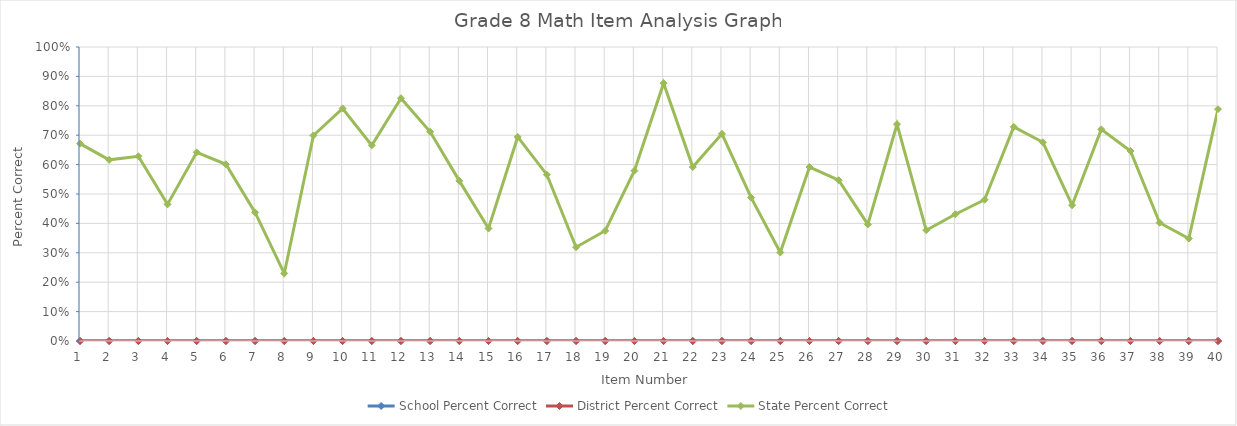
| Category | School Percent Correct | District Percent Correct | State Percent Correct |
|---|---|---|---|
| 1.0 | 0 | 0 | 0.671 |
| 2.0 | 0 | 0 | 0.616 |
| 3.0 | 0 | 0 | 0.628 |
| 4.0 | 0 | 0 | 0.465 |
| 5.0 | 0 | 0 | 0.642 |
| 6.0 | 0 | 0 | 0.601 |
| 7.0 | 0 | 0 | 0.438 |
| 8.0 | 0 | 0 | 0.23 |
| 9.0 | 0 | 0 | 0.699 |
| 10.0 | 0 | 0 | 0.791 |
| 11.0 | 0 | 0 | 0.666 |
| 12.0 | 0 | 0 | 0.826 |
| 13.0 | 0 | 0 | 0.712 |
| 14.0 | 0 | 0 | 0.545 |
| 15.0 | 0 | 0 | 0.383 |
| 16.0 | 0 | 0 | 0.694 |
| 17.0 | 0 | 0 | 0.566 |
| 18.0 | 0 | 0 | 0.319 |
| 19.0 | 0 | 0 | 0.375 |
| 20.0 | 0 | 0 | 0.579 |
| 21.0 | 0 | 0 | 0.877 |
| 22.0 | 0 | 0 | 0.592 |
| 23.0 | 0 | 0 | 0.705 |
| 24.0 | 0 | 0 | 0.488 |
| 25.0 | 0 | 0 | 0.301 |
| 26.0 | 0 | 0 | 0.592 |
| 27.0 | 0 | 0 | 0.547 |
| 28.0 | 0 | 0 | 0.397 |
| 29.0 | 0 | 0 | 0.737 |
| 30.0 | 0 | 0 | 0.377 |
| 31.0 | 0 | 0 | 0.431 |
| 32.0 | 0 | 0 | 0.481 |
| 33.0 | 0 | 0 | 0.728 |
| 34.0 | 0 | 0 | 0.676 |
| 35.0 | 0 | 0 | 0.462 |
| 36.0 | 0 | 0 | 0.72 |
| 37.0 | 0 | 0 | 0.646 |
| 38.0 | 0 | 0 | 0.402 |
| 39.0 | 0 | 0 | 0.348 |
| 40.0 | 0 | 0 | 0.788 |